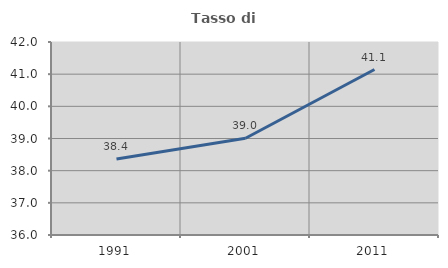
| Category | Tasso di occupazione   |
|---|---|
| 1991.0 | 38.36 |
| 2001.0 | 39.007 |
| 2011.0 | 41.145 |